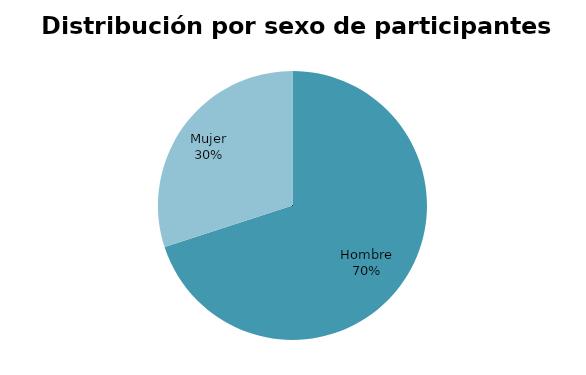
| Category | Series 0 |
|---|---|
| Hombre | 7 |
| Mujer | 3 |